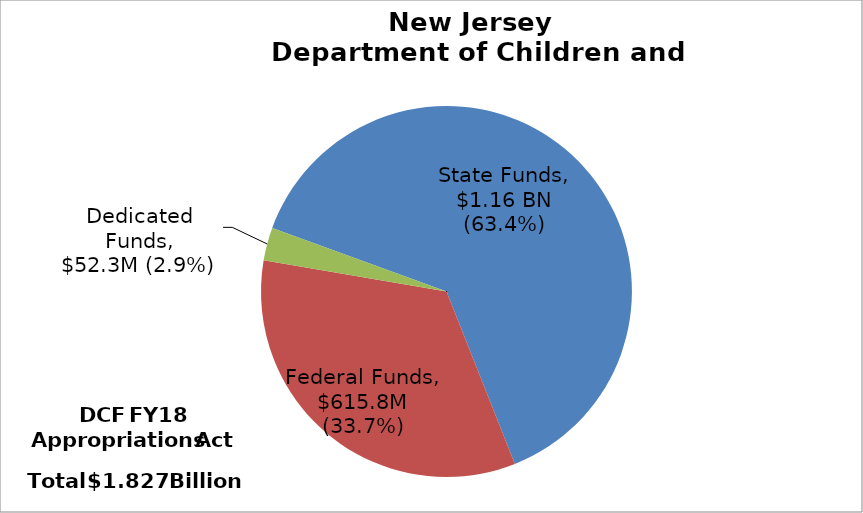
| Category | Series 0 | Series 1 |
|---|---|---|
| State Funds | 1159005 | 0.634 |
| Federal Funds | 615809 | 0.337 |
| Dedicated Funds | 52276 | 0.029 |